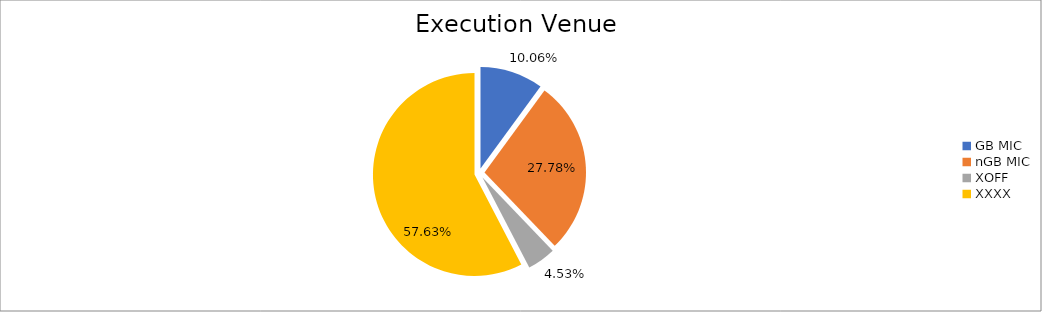
| Category | Series 0 |
|---|---|
| GB MIC | 996899.175 |
| nGB MIC | 2752131.232 |
| XOFF | 448816.592 |
| XXXX | 5708923.012 |